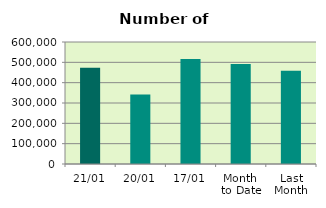
| Category | Series 0 |
|---|---|
| 21/01 | 472796 |
| 20/01 | 341768 |
| 17/01 | 516792 |
| Month 
to Date | 492342 |
| Last
Month | 458836.4 |